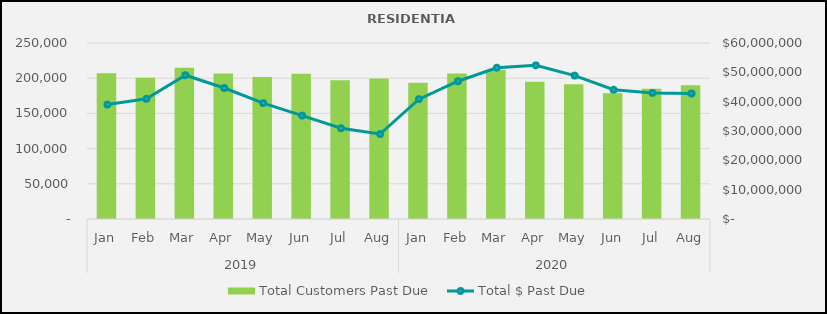
| Category | Total Customers Past Due  |
|---|---|
| 0 | 207018 |
| 1 | 200641 |
| 2 | 214880 |
| 3 | 206792 |
| 4 | 201819 |
| 5 | 206306 |
| 6 | 197108 |
| 7 | 199595 |
| 8 | 193558 |
| 9 | 206806 |
| 10 | 212041 |
| 11 | 194993 |
| 12 | 191422 |
| 13 | 178668 |
| 14 | 184971 |
| 15 | 190051 |